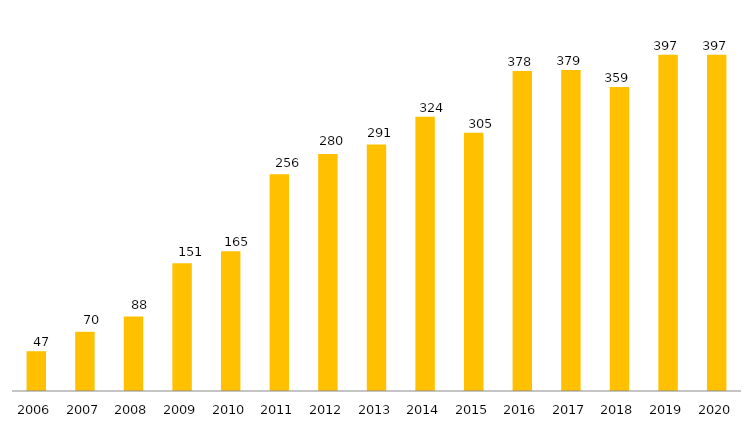
| Category | Programa |
|---|---|
| 2006.0 | 47 |
| 2007.0 | 70 |
| 2008.0 | 88 |
| 2009.0 | 151 |
| 2010.0 | 165 |
| 2011.0 | 256 |
| 2012.0 | 280 |
| 2013.0 | 291 |
| 2014.0 | 324 |
| 2015.0 | 305 |
| 2016.0 | 378 |
| 2017.0 | 379 |
| 2018.0 | 359 |
| 2019.0 | 397 |
| 2020.0 | 397 |